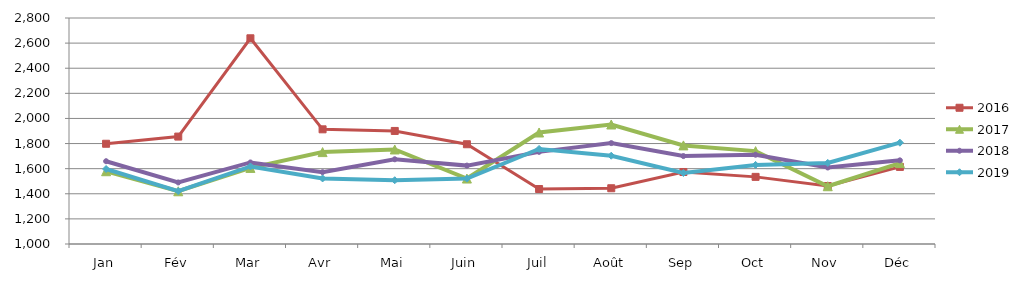
| Category | 2015 | 2016 | 2017 | 2018 | 2019 |
|---|---|---|---|---|---|
| Jan |  | 1798.335 | 1579.636 | 1659.352 | 1597.289 |
| Fév |  | 1855.46 | 1419.994 | 1490.226 | 1421.076 |
| Mar |  | 2638.359 | 1605.993 | 1649.547 | 1617.71 |
| Avr |  | 1913.428 | 1731.901 | 1571.843 | 1522.101 |
| Mai |  | 1900.494 | 1752.808 | 1674.845 | 1507.752 |
| Juin |  | 1794.503 | 1521.429 | 1624.315 | 1521.133 |
| Juil |  | 1437.865 | 1888.057 | 1733.745 | 1757.176 |
| Août |  | 1444.079 | 1951.885 | 1803.575 | 1703.011 |
| Sep |  | 1573.489 | 1785.279 | 1700.387 | 1565.468 |
| Oct |  | 1534.638 | 1739.683 | 1710.986 | 1630.005 |
| Nov |  | 1461.796 | 1460.108 | 1609.293 | 1645.734 |
| Déc |  | 1613.965 | 1644.609 | 1666.244 | 1806.869 |